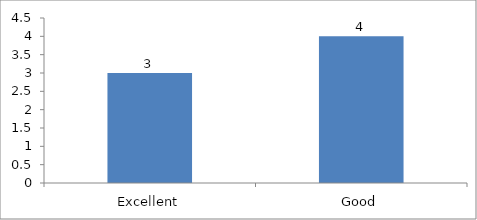
| Category | How would you rate this session or workshop? |
|---|---|
| Excellent | 3 |
| Good | 4 |